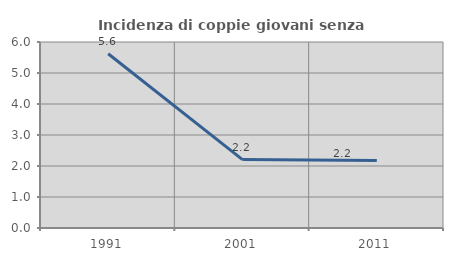
| Category | Incidenza di coppie giovani senza figli |
|---|---|
| 1991.0 | 5.62 |
| 2001.0 | 2.207 |
| 2011.0 | 2.174 |